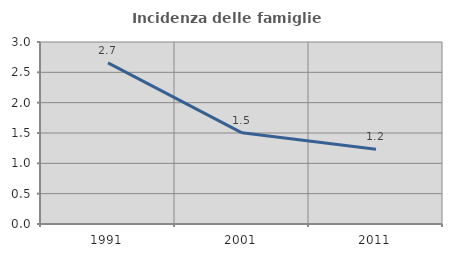
| Category | Incidenza delle famiglie numerose |
|---|---|
| 1991.0 | 2.655 |
| 2001.0 | 1.502 |
| 2011.0 | 1.233 |